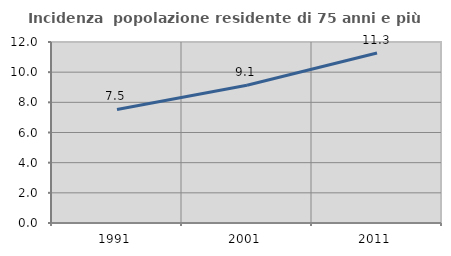
| Category | Incidenza  popolazione residente di 75 anni e più |
|---|---|
| 1991.0 | 7.528 |
| 2001.0 | 9.132 |
| 2011.0 | 11.273 |